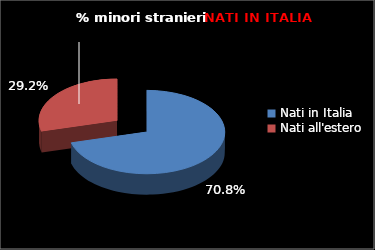
| Category | Series 0 |
|---|---|
| Nati in Italia | 51 |
| Nati all'estero | 21 |